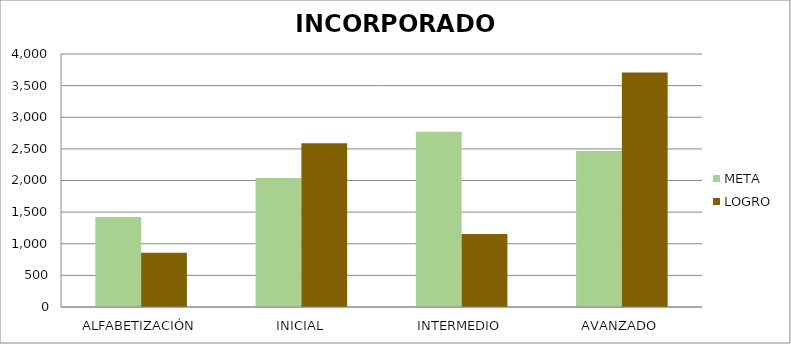
| Category | META | LOGRO |
|---|---|---|
| ALFABETIZACIÓN | 1423 | 859 |
| INICIAL | 2041 | 2588 |
| INTERMEDIO | 2771 | 1153 |
| AVANZADO | 2466 | 3708 |